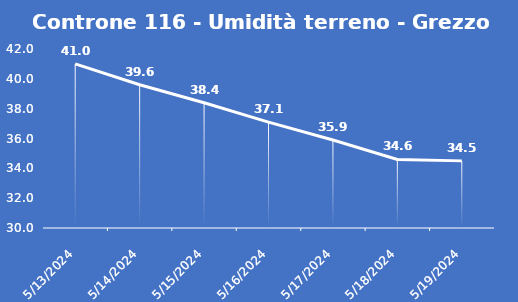
| Category | Controne 116 - Umidità terreno - Grezzo (%VWC) |
|---|---|
| 5/13/24 | 41 |
| 5/14/24 | 39.6 |
| 5/15/24 | 38.4 |
| 5/16/24 | 37.1 |
| 5/17/24 | 35.9 |
| 5/18/24 | 34.6 |
| 5/19/24 | 34.5 |